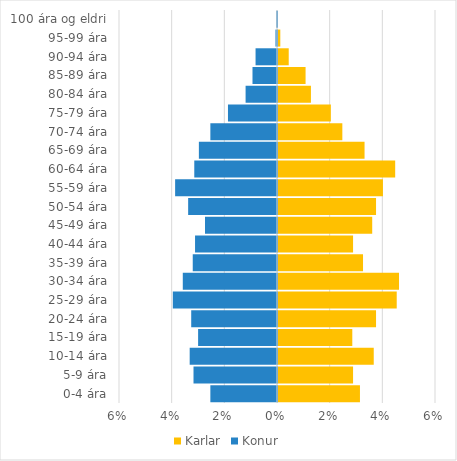
| Category | Karlar | Konur |
|---|---|---|
| 0-4 ára | 0.031 | -0.025 |
| 5-9 ára | 0.029 | -0.032 |
| 10-14 ára | 0.036 | -0.033 |
| 15-19 ára | 0.028 | -0.03 |
| 20-24 ára | 0.037 | -0.033 |
| 25-29 ára | 0.045 | -0.04 |
| 30-34 ára | 0.046 | -0.036 |
| 35-39 ára | 0.032 | -0.032 |
| 40-44 ára | 0.029 | -0.031 |
| 45-49 ára | 0.036 | -0.027 |
| 50-54 ára | 0.037 | -0.034 |
| 55-59 ára | 0.04 | -0.039 |
| 60-64 ára | 0.045 | -0.031 |
| 65-69 ára | 0.033 | -0.03 |
| 70-74 ára | 0.024 | -0.025 |
| 75-79 ára | 0.02 | -0.019 |
| 80-84 ára | 0.013 | -0.012 |
| 85-89 ára | 0.01 | -0.009 |
| 90-94 ára | 0.004 | -0.008 |
| 95-99 ára | 0.001 | -0.001 |
| 100 ára og eldri | 0 | 0 |